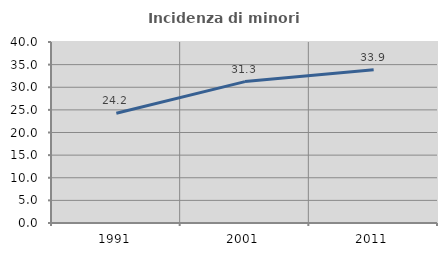
| Category | Incidenza di minori stranieri |
|---|---|
| 1991.0 | 24.242 |
| 2001.0 | 31.25 |
| 2011.0 | 33.876 |